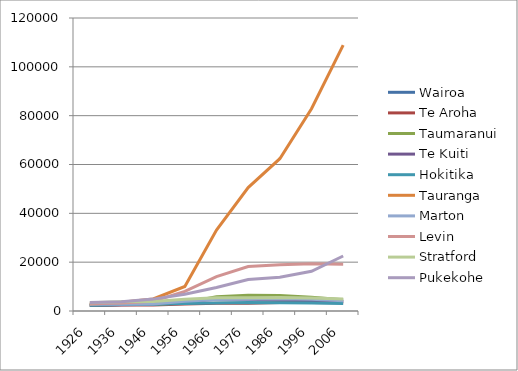
| Category | Wairoa | Te Aroha | Taumaranui | Te Kuiti | Hokitika | Tauranga | Marton | Levin | Stratford | Pukekohe |
|---|---|---|---|---|---|---|---|---|---|---|
| 1926.0 | 2285.477 | 2313.967 | 2333.692 | 2362.811 | 2402.624 | 2684.513 | 2783.095 | 2936.222 | 3400.027 | 3457.607 |
| 1936.0 | 2660.767 | 2407.584 | 2693.899 | 2542.922 | 2704.335 | 3616.724 | 2810.824 | 3304.182 | 3831.663 | 3800.82 |
| 1946.0 | 2857 | 2426 | 2706 | 2720 | 2742 | 4944.686 | 2915 | 4021.158 | 3854 | 4867.026 |
| 1956.0 | 3796 | 2854 | 3344 | 3781 | 3032 | 10044.681 | 4001 | 8005.3 | 4811 | 6896.792 |
| 1966.0 | 5100 | 3212 | 5864 | 4825 | 3258 | 33166.757 | 4731 | 14068.501 | 5441 | 9629.621 |
| 1976.0 | 5466 | 3202 | 6479 | 4840 | 3530 | 50530.876 | 4910 | 18210.578 | 5444 | 12899.309 |
| 1986.0 | 5094 | 3510 | 6387 | 4521 | 3427 | 62370 | 5059 | 18962 | 5528 | 13823 |
| 1996.0 | 4758.132 | 3471.848 | 5613.105 | 4299 | 3321.422 | 82832 | 4847.089 | 19357.534 | 5318.996 | 16267.195 |
| 2006.0 | 3940.231 | 3372.065 | 4573.875 | 3885 | 3070.318 | 108882 | 4226.28 | 19171.574 | 4864.64 | 22518 |